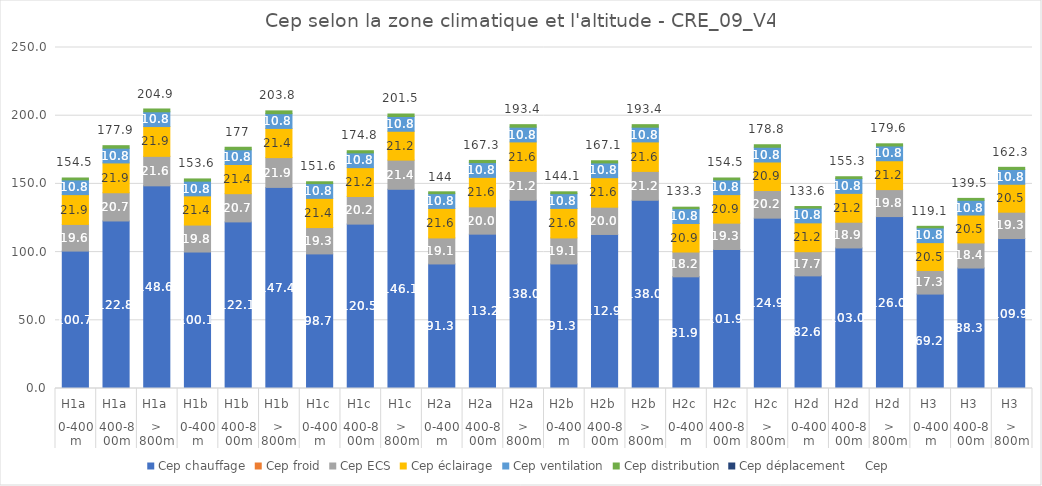
| Category | Cep chauffage | Cep froid | Cep ECS | Cep éclairage | Cep ventilation | Cep distribution | Cep déplacement |
|---|---|---|---|---|---|---|---|
| 0 | 100.74 | 0 | 19.55 | 21.85 | 10.81 | 1.38 | 0 |
| 1 | 122.82 | 0 | 20.7 | 21.85 | 10.81 | 1.84 | 0 |
| 2 | 148.58 | 0 | 21.62 | 21.85 | 10.81 | 2.07 | 0 |
| 3 | 100.05 | 0 | 19.78 | 21.39 | 10.81 | 1.61 | 0 |
| 4 | 122.13 | 0 | 20.7 | 21.39 | 10.81 | 1.84 | 0 |
| 5 | 147.43 | 0 | 21.85 | 21.39 | 10.81 | 2.07 | 0 |
| 6 | 98.67 | 0 | 19.32 | 21.39 | 10.81 | 1.38 | 0 |
| 7 | 120.52 | 0 | 20.24 | 21.16 | 10.81 | 1.61 | 0 |
| 8 | 146.05 | 0 | 21.39 | 21.16 | 10.81 | 1.84 | 0 |
| 9 | 91.31 | 0 | 19.09 | 21.62 | 10.81 | 1.38 | 0 |
| 10 | 113.16 | 0 | 20.01 | 21.62 | 10.81 | 1.61 | 0 |
| 11 | 138 | 0 | 21.16 | 21.62 | 10.81 | 1.84 | 0 |
| 12 | 91.31 | 0 | 19.09 | 21.62 | 10.81 | 1.38 | 0 |
| 13 | 112.93 | 0 | 20.01 | 21.62 | 10.81 | 1.61 | 0 |
| 14 | 138 | 0 | 21.16 | 21.62 | 10.81 | 1.84 | 0 |
| 15 | 81.88 | 0 | 18.17 | 20.93 | 10.81 | 1.15 | 0 |
| 16 | 101.89 | 0 | 19.32 | 20.93 | 10.81 | 1.38 | 0 |
| 17 | 124.89 | 0 | 20.24 | 20.93 | 10.81 | 1.84 | 0 |
| 18 | 82.57 | 0 | 17.71 | 21.16 | 10.81 | 1.15 | 0 |
| 19 | 103.04 | 0 | 18.86 | 21.16 | 10.81 | 1.38 | 0 |
| 20 | 126.04 | 0 | 19.78 | 21.16 | 10.81 | 1.61 | 0 |
| 21 | 69.23 | 0 | 17.25 | 20.47 | 10.81 | 1.15 | 0 |
| 22 | 88.32 | 0 | 18.4 | 20.47 | 10.81 | 1.38 | 0 |
| 23 | 109.94 | 0 | 19.32 | 20.47 | 10.81 | 1.61 | 0 |